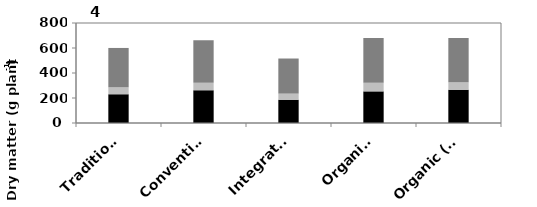
| Category | Tuber  | Stem  | Leaf  |
|---|---|---|---|
| Traditional | 230 | 55.4 | 315 |
| Conventional | 262 | 59.6 | 340 |
| Integrated | 186 | 48.9 | 281 |
| Organic  | 253 | 69.2 | 358 |
| Organic (with biofertilizers) | 266 | 60.4 | 353 |